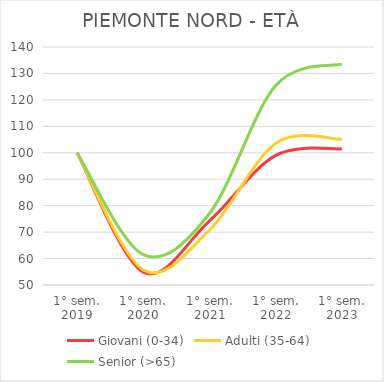
| Category | Giovani (0-34) | Adulti (35-64) | Senior (>65) |
|---|---|---|---|
| 1° sem.
2019 | 100 | 100 | 100 |
| 1° sem.
2020 | 54.864 | 55.691 | 61.475 |
| 1° sem.
2021 | 74.282 | 70.806 | 77.049 |
| 1° sem.
2022 | 98.995 | 103.555 | 125.41 |
| 1° sem.
2023 | 101.508 | 105.128 | 133.607 |